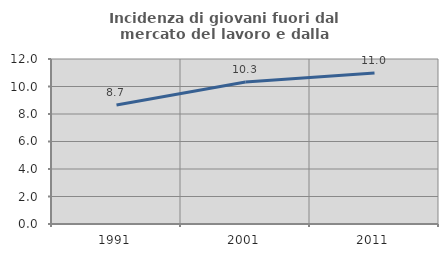
| Category | Incidenza di giovani fuori dal mercato del lavoro e dalla formazione  |
|---|---|
| 1991.0 | 8.654 |
| 2001.0 | 10.323 |
| 2011.0 | 10.983 |